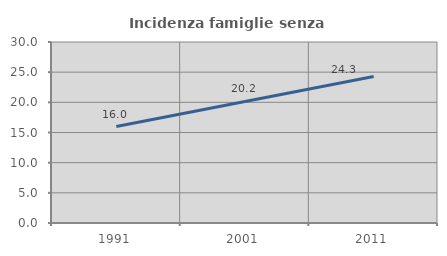
| Category | Incidenza famiglie senza nuclei |
|---|---|
| 1991.0 | 15.99 |
| 2001.0 | 20.154 |
| 2011.0 | 24.268 |